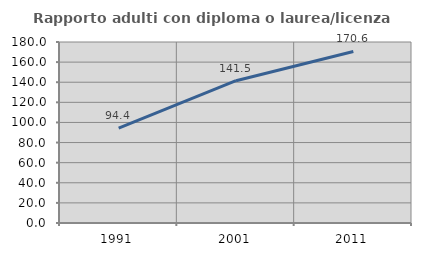
| Category | Rapporto adulti con diploma o laurea/licenza media  |
|---|---|
| 1991.0 | 94.382 |
| 2001.0 | 141.538 |
| 2011.0 | 170.588 |